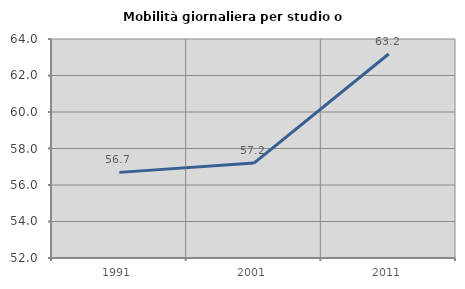
| Category | Mobilità giornaliera per studio o lavoro |
|---|---|
| 1991.0 | 56.692 |
| 2001.0 | 57.201 |
| 2011.0 | 63.179 |